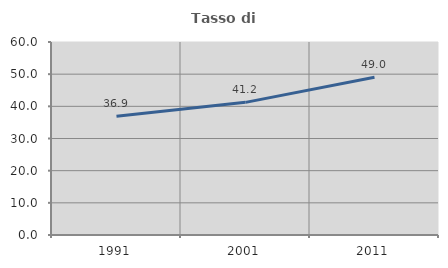
| Category | Tasso di occupazione   |
|---|---|
| 1991.0 | 36.918 |
| 2001.0 | 41.234 |
| 2011.0 | 49.02 |